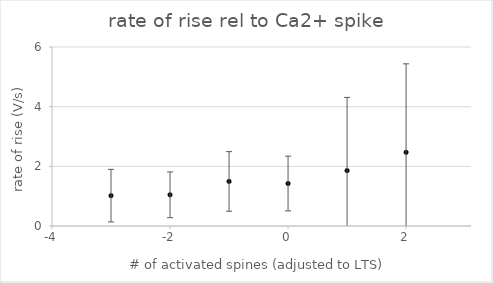
| Category | Series 0 |
|---|---|
| -3.0 | 1.018 |
| -2.0 | 1.046 |
| -1.0 | 1.494 |
| 0.0 | 1.424 |
| 1.0 | 1.857 |
| 2.0 | 2.47 |